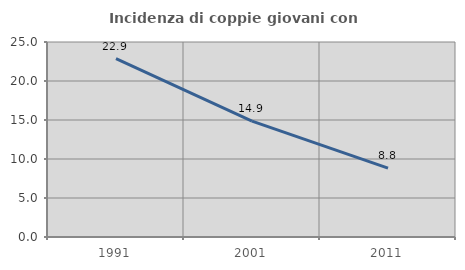
| Category | Incidenza di coppie giovani con figli |
|---|---|
| 1991.0 | 22.855 |
| 2001.0 | 14.856 |
| 2011.0 | 8.837 |